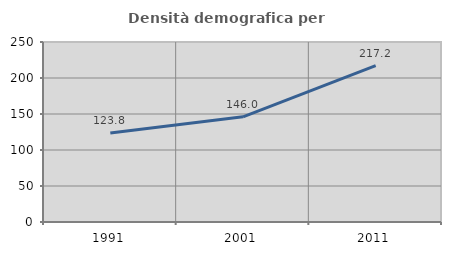
| Category | Densità demografica |
|---|---|
| 1991.0 | 123.762 |
| 2001.0 | 146.029 |
| 2011.0 | 217.166 |